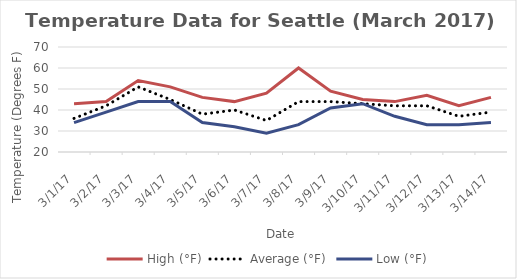
| Category | High (°F) | Average (°F) | Low (°F) |
|---|---|---|---|
| 3/1/17 | 43 | 36 | 34 |
| 3/2/17 | 44 | 42 | 39 |
| 3/3/17 | 54 | 51 | 44 |
| 3/4/17 | 51 | 45 | 44 |
| 3/5/17 | 46 | 38 | 34 |
| 3/6/17 | 44 | 40 | 32 |
| 3/7/17 | 48 | 35 | 29 |
| 3/8/17 | 60 | 44 | 33 |
| 3/9/17 | 49 | 44 | 41 |
| 3/10/17 | 45 | 43 | 43 |
| 3/11/17 | 44 | 42 | 37 |
| 3/12/17 | 47 | 42 | 33 |
| 3/13/17 | 42 | 37 | 33 |
| 3/14/17 | 46 | 39 | 34 |